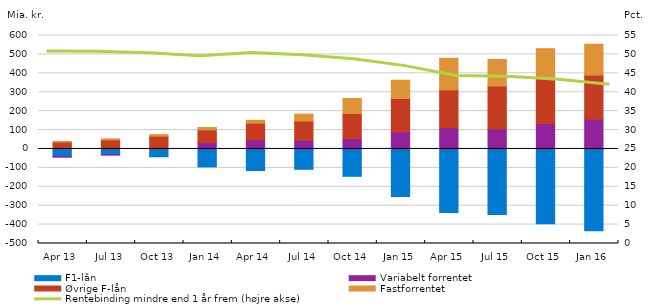
| Category | F1-lån | Variabelt forrentet | Øvrige F-lån | Fastforrentet |
|---|---|---|---|---|
| 2013-04-01 | -39.6 | -4.2 | 36.5 | 2.3 |
| 2013-07-01 | -30.3 | -2.2 | 47.8 | 5.4 |
| 2013-10-01 | -41.3 | 0.6 | 67.1 | 8 |
| 2014-01-01 | -94.7 | 33 | 67.8 | 12.5 |
| 2014-04-01 | -113.9 | 48.8 | 87.1 | 15.6 |
| 2014-07-01 | -107.5 | 46.4 | 101.1 | 36.7 |
| 2014-10-01 | -144.7 | 54 | 133.3 | 79.4 |
| 2015-01-01 | -250.9 | 90.5 | 176.3 | 96.6 |
| 2015-04-01 | -335.7 | 112.7 | 200 | 167 |
| 2015-07-01 | -347 | 106.1 | 226.7 | 140.9 |
| 2015-10-01 | -396.2 | 134.6 | 242 | 153.7 |
| 2016-01-01 | -432.6 | 156.8 | 233.9 | 163.1 |